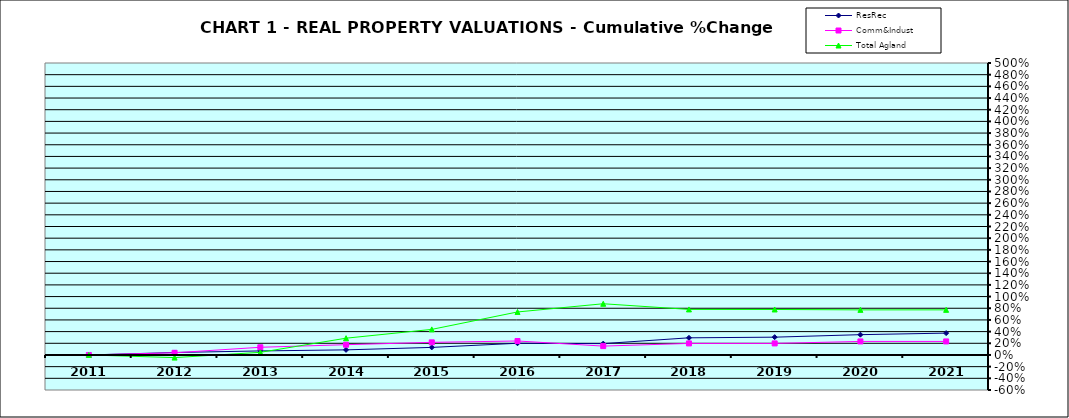
| Category | ResRec | Comm&Indust | Total Agland |
|---|---|---|---|
| 2011.0 | 0 | 0 | 0 |
| 2012.0 | 0.042 | 0.038 | -0.045 |
| 2013.0 | 0.069 | 0.132 | 0.045 |
| 2014.0 | 0.087 | 0.176 | 0.287 |
| 2015.0 | 0.13 | 0.216 | 0.438 |
| 2016.0 | 0.2 | 0.239 | 0.736 |
| 2017.0 | 0.195 | 0.152 | 0.877 |
| 2018.0 | 0.293 | 0.198 | 0.78 |
| 2019.0 | 0.305 | 0.198 | 0.779 |
| 2020.0 | 0.348 | 0.232 | 0.772 |
| 2021.0 | 0.374 | 0.232 | 0.773 |